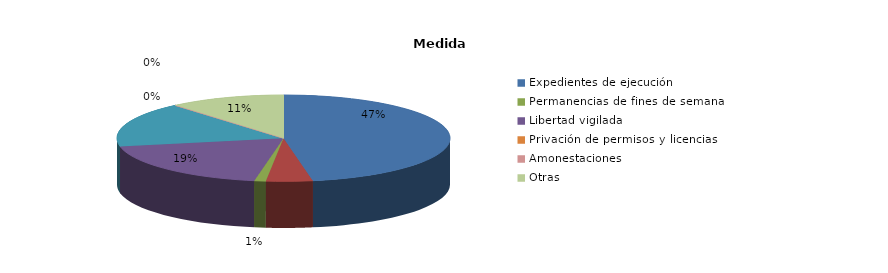
| Category | Series 0 |
|---|---|
| Expedientes de ejecución | 42 |
| Internamientos | 4 |
| Permanencias de fines de semana | 1 |
| Libertad vigilada | 17 |
| Prestaciones en beneficio de la comunidad | 15 |
| Privación de permisos y licencias | 0 |
| Convivencia Familiar Educativa | 0 |
| Amonestaciones | 0 |
| Otras | 10 |